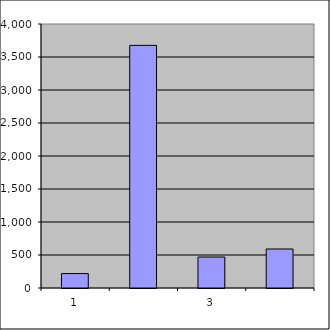
| Category | Series 0 |
|---|---|
| 0 | 218.75 |
| 1 | 3676.365 |
| 2 | 469.424 |
| 3 | 591.04 |